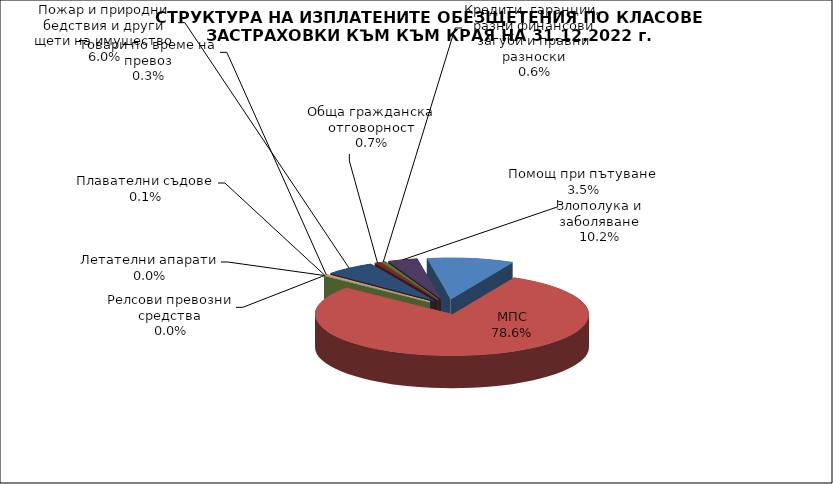
| Category | Злополука и заболяване |
|---|---|
| Злополука и заболяване | 0.102 |
| МПС | 0.786 |
| Релсови превозни средства | 0 |
| Летателни апарати | 0 |
| Плавателни съдове | 0.001 |
| Товари по време на превоз | 0.003 |
| Пожар и природни бедствия и други щети на имущество | 0.06 |
| Обща гражданска отговорност | 0.007 |
| Кредити, гаранции, разни финансови загуби и правни разноски | 0.006 |
| Помощ при пътуване | 0.035 |